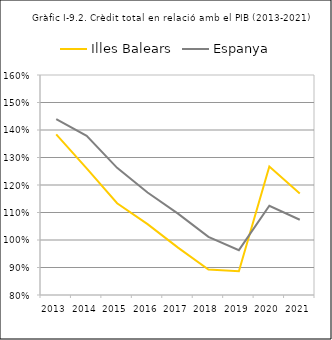
| Category | Illes Balears | Espanya |
|---|---|---|
| 2013.0 | 1.384 | 1.44 |
| 2014.0 | 1.26 | 1.379 |
| 2015.0 | 1.134 | 1.262 |
| 2016.0 | 1.058 | 1.173 |
| 2017.0 | 0.972 | 1.096 |
| 2018.0 | 0.893 | 1.011 |
| 2019.0 | 0.887 | 0.963 |
| 2020.0 | 1.268 | 1.125 |
| 2021.0 | 1.169 | 1.074 |